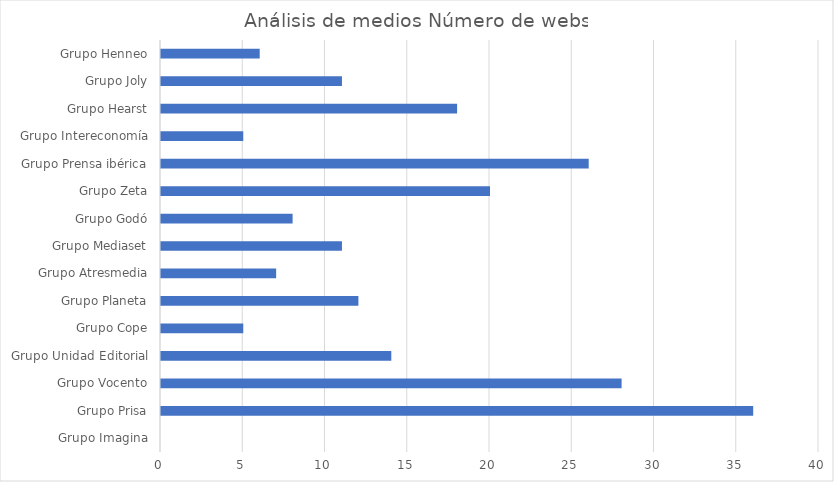
| Category | Análisis de medios |
|---|---|
| Grupo Imagina | 0 |
| Grupo Prisa | 36 |
| Grupo Vocento | 28 |
| Grupo Unidad Editorial | 14 |
| Grupo Cope | 5 |
| Grupo Planeta | 12 |
| Grupo Atresmedia | 7 |
| Grupo Mediaset | 11 |
| Grupo Godó | 8 |
| Grupo Zeta | 20 |
| Grupo Prensa ibérica | 26 |
| Grupo Intereconomía | 5 |
| Grupo Hearst | 18 |
| Grupo Joly | 11 |
| Grupo Henneo | 6 |